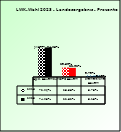
| Category | 2018 | 2023 |
|---|---|---|
| Bgld. Bauernbund | 0.721 | 0.741 |
| SPÖ Bauern | 0.236 | 0.228 |
| Freiheitliche Bauern | 0.037 | 0.031 |